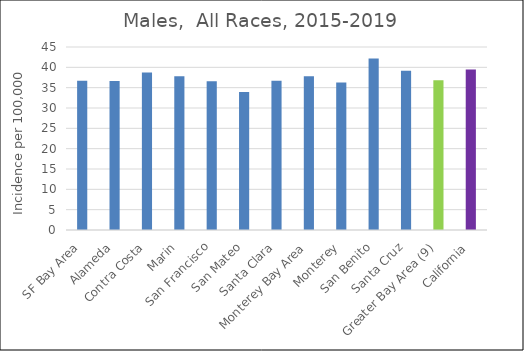
| Category | Male |
|---|---|
| SF Bay Area | 36.68 |
|   Alameda | 36.67 |
|   Contra Costa | 38.76 |
|   Marin | 37.79 |
|   San Francisco | 36.6 |
|   San Mateo | 33.92 |
|   Santa Clara | 36.68 |
| Monterey Bay Area | 37.78 |
|   Monterey | 36.25 |
|   San Benito | 42.19 |
|   Santa Cruz | 39.16 |
| Greater Bay Area (9) | 36.8 |
| California | 39.44 |